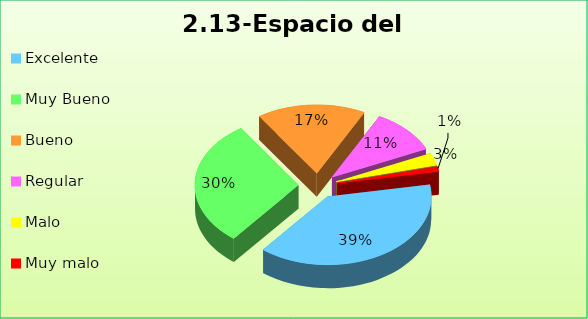
| Category | Series 0 |
|---|---|
| Excelente | 0.385 |
| Muy Bueno | 0.299 |
| Bueno  | 0.17 |
| Regular  | 0.106 |
| Malo  | 0.029 |
| Muy malo  | 0.011 |